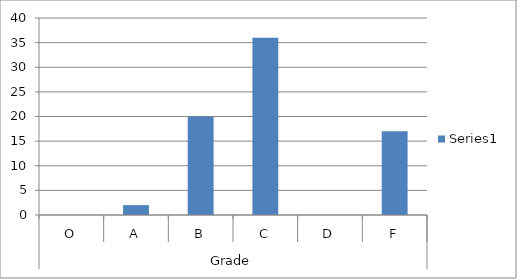
| Category | Series 0 |
|---|---|
| 0 | 0 |
| 1 | 2 |
| 2 | 20 |
| 3 | 36 |
| 4 | 0 |
| 5 | 17 |